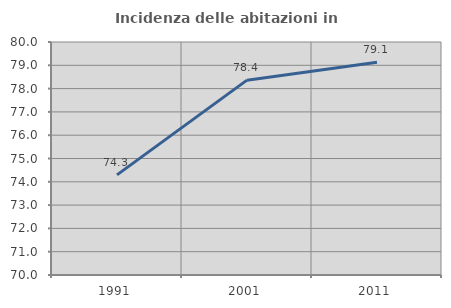
| Category | Incidenza delle abitazioni in proprietà  |
|---|---|
| 1991.0 | 74.297 |
| 2001.0 | 78.362 |
| 2011.0 | 79.131 |